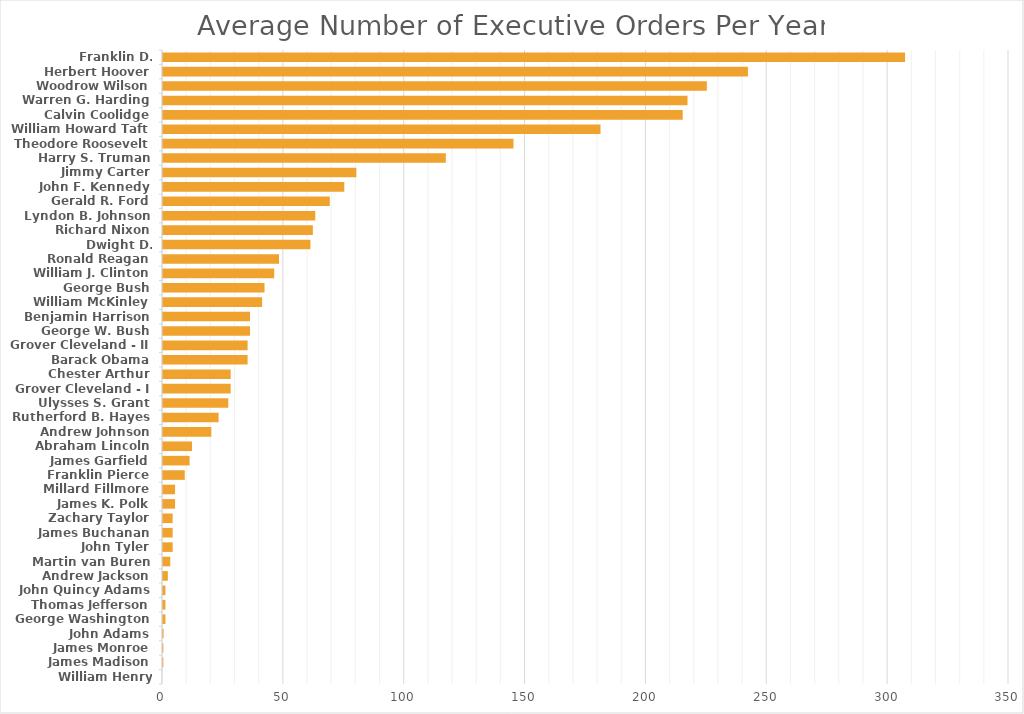
| Category | Average / Year |
|---|---|
| William Henry Harrison | 0 |
| James Madison | 0.13 |
| James Monroe | 0.13 |
| John Adams | 0.25 |
| George Washington | 1 |
| Thomas Jefferson | 1 |
| John Quincy Adams | 1 |
| Andrew Jackson | 2 |
| Martin van Buren | 3 |
| John Tyler | 4 |
| James Buchanan | 4 |
| Zachary Taylor | 4 |
| James K. Polk | 5 |
| Millard Fillmore | 5 |
| Franklin Pierce | 9 |
| James Garfield | 11 |
| Abraham Lincoln | 12 |
| Andrew Johnson | 20 |
| Rutherford B. Hayes | 23 |
| Ulysses S. Grant | 27 |
| Grover Cleveland - I | 28 |
| Chester Arthur | 28 |
| Barack Obama | 35 |
| Grover Cleveland - II | 35 |
| George W. Bush | 36 |
| Benjamin Harrison | 36 |
| William McKinley | 41 |
| George Bush | 42 |
| William J. Clinton | 46 |
| Ronald Reagan | 48 |
| Dwight D. Eisenhower | 61 |
| Richard Nixon | 62 |
| Lyndon B. Johnson | 63 |
| Gerald R. Ford | 69 |
| John F. Kennedy | 75 |
| Jimmy Carter | 80 |
| Harry S. Truman | 117 |
| Theodore Roosevelt | 145 |
| William Howard Taft | 181 |
| Calvin Coolidge | 215 |
| Warren G. Harding | 217 |
| Woodrow Wilson | 225 |
| Herbert Hoover | 242 |
| Franklin D. Roosevelt | 307 |